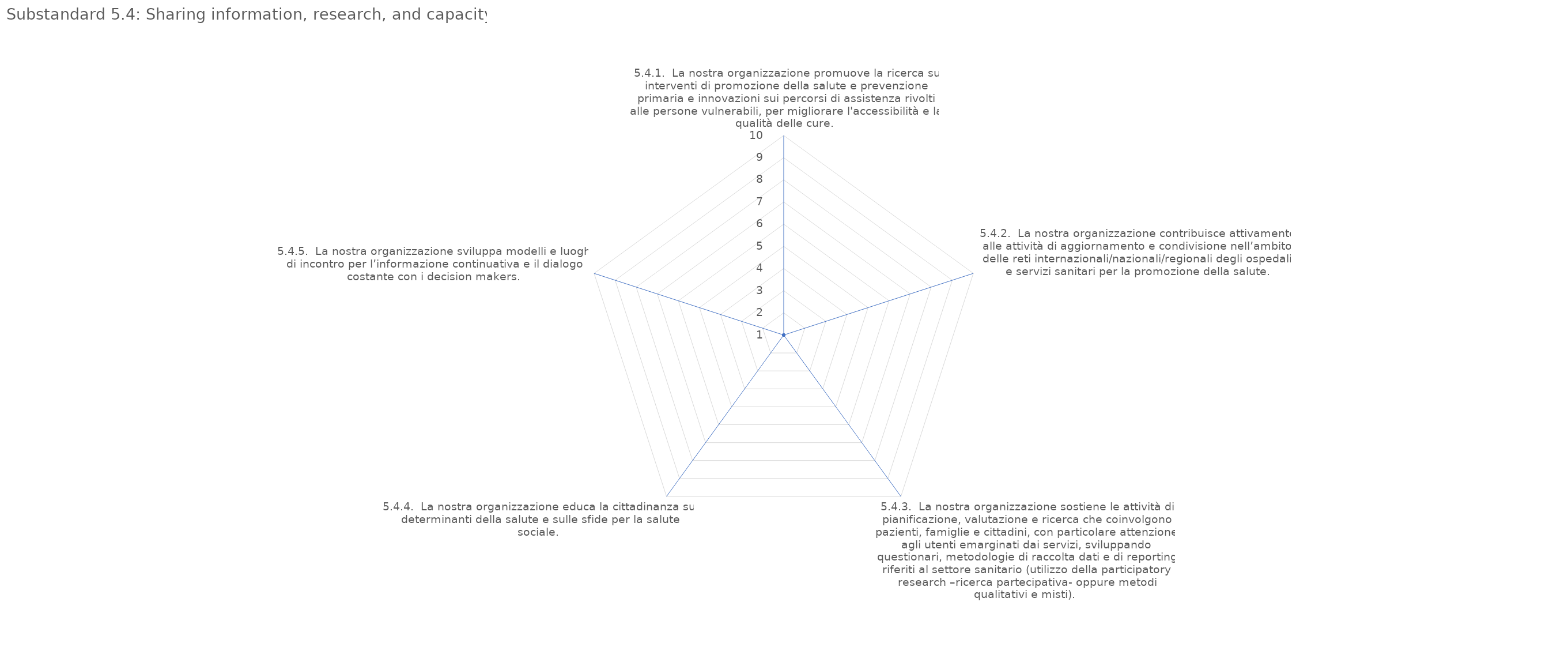
| Category | value |
|---|---|
| 5.4.1.  La nostra organizzazione promuove la ricerca su interventi di promozione della salute e prevenzione primaria e innovazioni sui percorsi di assistenza rivolti alle persone vulnerabili, per migliorare l'accessibilità e la qualità delle cure. | 1 |
| 5.4.2.  La nostra organizzazione contribuisce attivamente alle attività di aggiornamento e condivisione nell’ambito delle reti internazionali/nazionali/regionali degli ospedali e servizi sanitari per la promozione della salute. | 1 |
| 5.4.3.  La nostra organizzazione sostiene le attività di pianificazione, valutazione e ricerca che coinvolgono pazienti, famiglie e cittadini, con particolare attenzione agli utenti emarginati dai servizi, sviluppando questionari, metodologie di raccolta  | 1 |
| 5.4.4.  La nostra organizzazione educa la cittadinanza sui determinanti della salute e sulle sfide per la salute sociale. | 1 |
| 5.4.5.  La nostra organizzazione sviluppa modelli e luoghi di incontro per l’informazione continuativa e il dialogo costante con i decision makers. | 1 |